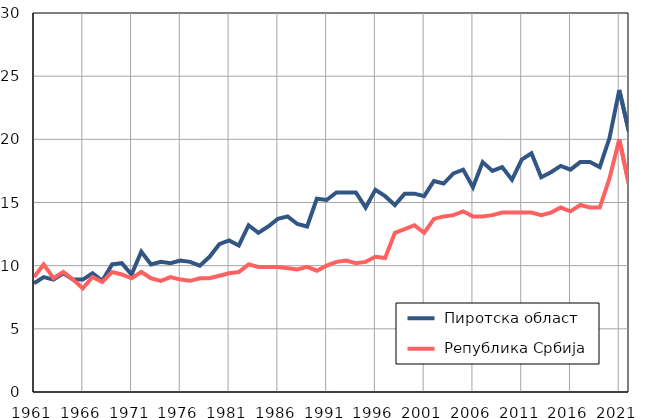
| Category |  Пиротска област |  Република Србија |
|---|---|---|
| 1961.0 | 8.6 | 9.1 |
| 1962.0 | 9.1 | 10.1 |
| 1963.0 | 8.9 | 9 |
| 1964.0 | 9.4 | 9.5 |
| 1965.0 | 8.9 | 8.9 |
| 1966.0 | 8.9 | 8.2 |
| 1967.0 | 9.4 | 9.1 |
| 1968.0 | 8.8 | 8.7 |
| 1969.0 | 10.1 | 9.5 |
| 1970.0 | 10.2 | 9.3 |
| 1971.0 | 9.3 | 9 |
| 1972.0 | 11.1 | 9.5 |
| 1973.0 | 10.1 | 9 |
| 1974.0 | 10.3 | 8.8 |
| 1975.0 | 10.2 | 9.1 |
| 1976.0 | 10.4 | 8.9 |
| 1977.0 | 10.3 | 8.8 |
| 1978.0 | 10 | 9 |
| 1979.0 | 10.7 | 9 |
| 1980.0 | 11.7 | 9.2 |
| 1981.0 | 12 | 9.4 |
| 1982.0 | 11.6 | 9.5 |
| 1983.0 | 13.2 | 10.1 |
| 1984.0 | 12.6 | 9.9 |
| 1985.0 | 13.1 | 9.9 |
| 1986.0 | 13.7 | 9.9 |
| 1987.0 | 13.9 | 9.8 |
| 1988.0 | 13.3 | 9.7 |
| 1989.0 | 13.1 | 9.9 |
| 1990.0 | 15.3 | 9.6 |
| 1991.0 | 15.2 | 10 |
| 1992.0 | 15.8 | 10.3 |
| 1993.0 | 15.8 | 10.4 |
| 1994.0 | 15.8 | 10.2 |
| 1995.0 | 14.6 | 10.3 |
| 1996.0 | 16 | 10.7 |
| 1997.0 | 15.5 | 10.6 |
| 1998.0 | 14.8 | 12.6 |
| 1999.0 | 15.7 | 12.9 |
| 2000.0 | 15.7 | 13.2 |
| 2001.0 | 15.5 | 12.6 |
| 2002.0 | 16.7 | 13.7 |
| 2003.0 | 16.5 | 13.9 |
| 2004.0 | 17.3 | 14 |
| 2005.0 | 17.6 | 14.3 |
| 2006.0 | 16.2 | 13.9 |
| 2007.0 | 18.2 | 13.9 |
| 2008.0 | 17.5 | 14 |
| 2009.0 | 17.8 | 14.2 |
| 2010.0 | 16.8 | 14.2 |
| 2011.0 | 18.4 | 14.2 |
| 2012.0 | 18.9 | 14.2 |
| 2013.0 | 17 | 14 |
| 2014.0 | 17.4 | 14.2 |
| 2015.0 | 17.9 | 14.6 |
| 2016.0 | 17.6 | 14.3 |
| 2017.0 | 18.2 | 14.8 |
| 2018.0 | 18.2 | 14.6 |
| 2019.0 | 17.8 | 14.6 |
| 2020.0 | 20.1 | 16.9 |
| 2021.0 | 23.9 | 20 |
| 2022.0 | 20.6 | 16.4 |